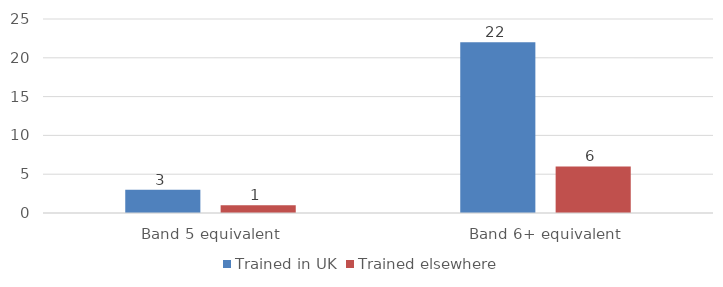
| Category | Trained in UK | Trained elsewhere |
|---|---|---|
| Band 5 equivalent | 3 | 1 |
| Band 6+ equivalent | 22 | 6 |